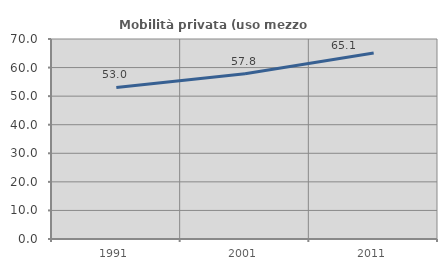
| Category | Mobilità privata (uso mezzo privato) |
|---|---|
| 1991.0 | 53.047 |
| 2001.0 | 57.831 |
| 2011.0 | 65.123 |